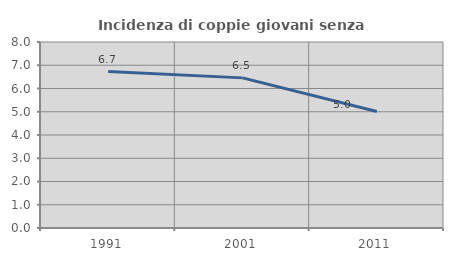
| Category | Incidenza di coppie giovani senza figli |
|---|---|
| 1991.0 | 6.727 |
| 2001.0 | 6.457 |
| 2011.0 | 5.008 |